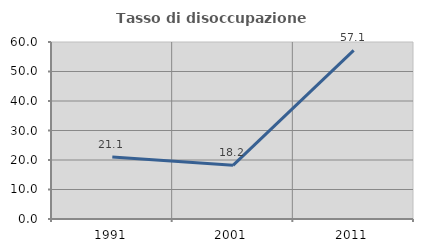
| Category | Tasso di disoccupazione giovanile  |
|---|---|
| 1991.0 | 21.053 |
| 2001.0 | 18.182 |
| 2011.0 | 57.143 |